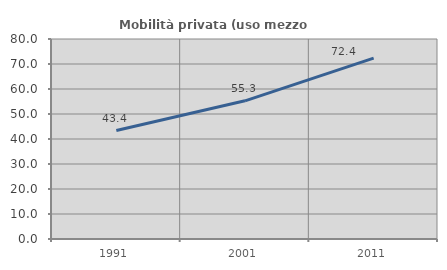
| Category | Mobilità privata (uso mezzo privato) |
|---|---|
| 1991.0 | 43.368 |
| 2001.0 | 55.269 |
| 2011.0 | 72.352 |